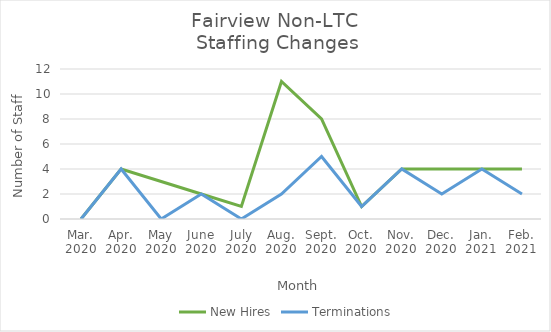
| Category | New Hires | Terminations |
|---|---|---|
| Mar.
2020 | 0 | 0 |
| Apr.
2020 | 4 | 4 |
| May
2020 | 3 | 0 |
| June
2020 | 2 | 2 |
| July
2020 | 1 | 0 |
| Aug.
2020 | 11 | 2 |
| Sept.
2020 | 8 | 5 |
| Oct.
2020 | 1 | 1 |
| Nov.
2020 | 4 | 4 |
| Dec.
2020 | 4 | 2 |
| Jan.
2021 | 4 | 4 |
| Feb.
2021 | 4 | 2 |